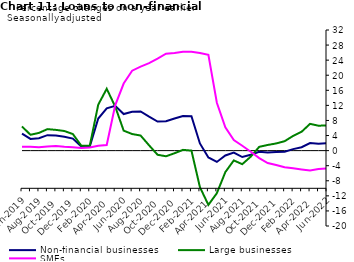
| Category | zero | Non-financial businesses | Large businesses | SMEs |
|---|---|---|---|---|
| Jun-2019 | 0 | 4.5 | 6.4 | 1 |
| Jul-2019 | 0 | 3.1 | 4.2 | 1 |
| Aug-2019 | 0 | 3.3 | 4.7 | 0.9 |
| Sep-2019 | 0 | 4.1 | 5.7 | 1.1 |
| Oct-2019 | 0 | 4 | 5.5 | 1.2 |
| Nov-2019 | 0 | 3.7 | 5.2 | 1 |
| Dec-2019 | 0 | 3.2 | 4.4 | 0.9 |
| Jan-2020 | 0 | 1.1 | 1.3 | 0.7 |
| Feb-2020 | 0 | 1.1 | 1.3 | 0.8 |
| Mar-2020 | 0 | 8.5 | 12.2 | 1.3 |
| Apr-2020 | 0 | 11.2 | 16.4 | 1.5 |
| May-2020 | 0 | 11.9 | 11.7 | 12 |
| Jun-2020 | 0 | 9.7 | 5.3 | 17.8 |
| Jul-2020 | 0 | 10.3 | 4.4 | 21.2 |
| Aug-2020 | 0 | 10.4 | 4 | 22.3 |
| Sep-2020 | 0 | 9 | 1.4 | 23.2 |
| Oct-2020 | 0 | 7.7 | -1.1 | 24.4 |
| Nov-2020 | 0 | 7.8 | -1.5 | 25.7 |
| Dec-2020 | 0 | 8.5 | -0.7 | 25.9 |
| Jan-2021 | 0 | 9.2 | 0.2 | 26.2 |
| Feb-2021 | 0 | 9.1 | 0 | 26.2 |
| Mar-2021 | 0 | 1.9 | -9.7 | 25.9 |
| Apr-2021 | 0 | -1.8 | -14.4 | 25.4 |
| May-2021 | 0 | -3 | -11.3 | 12.7 |
| Jun-2021 | 0 | -1.3 | -5.7 | 6.2 |
| Jul-2021 | 0 | -0.5 | -2.6 | 2.8 |
| Aug-2021 | 0 | -1.7 | -3.6 | 1.3 |
| Sep-2021 | 0 | -1.1 | -1.6 | -0.3 |
| Oct-2021 | 0 | -0.3 | 1 | -2 |
| Nov-2021 | 0 | -0.5 | 1.5 | -3.3 |
| Dec-2021 | 0 | -0.4 | 1.9 | -3.8 |
| Jan-2022 | 0 | -0.3 | 2.5 | -4.4 |
| Feb-2022 | 0 | 0.4 | 3.9 | -4.7 |
| Mar-2022 | 0 | 0.9 | 5 | -5 |
| Apr-2022 | 0 | 2 | 7.1 | -5.3 |
| May-2022 | 0 | 1.8 | 6.6 | -4.9 |
| Jun-2022 | 0 | 2 | 6.7 | -4.7 |